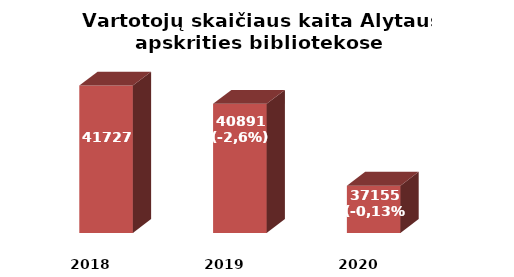
| Category | Series 0 |
|---|---|
| 2018.0 | 41727 |
| 2019.0 | 40891 |
| 2020.0 | 37155 |